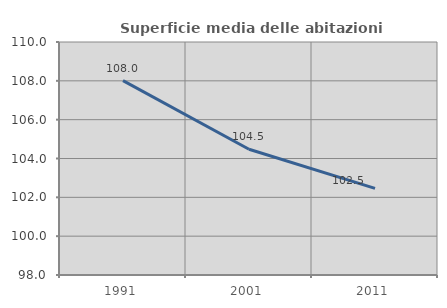
| Category | Superficie media delle abitazioni occupate |
|---|---|
| 1991.0 | 108.007 |
| 2001.0 | 104.478 |
| 2011.0 | 102.463 |